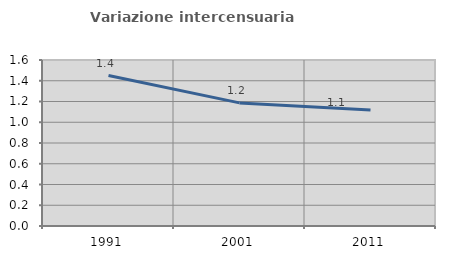
| Category | Variazione intercensuaria annua |
|---|---|
| 1991.0 | 1.45 |
| 2001.0 | 1.187 |
| 2011.0 | 1.119 |